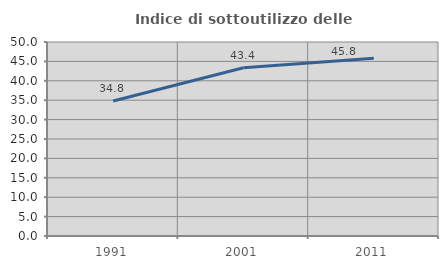
| Category | Indice di sottoutilizzo delle abitazioni  |
|---|---|
| 1991.0 | 34.788 |
| 2001.0 | 43.373 |
| 2011.0 | 45.798 |